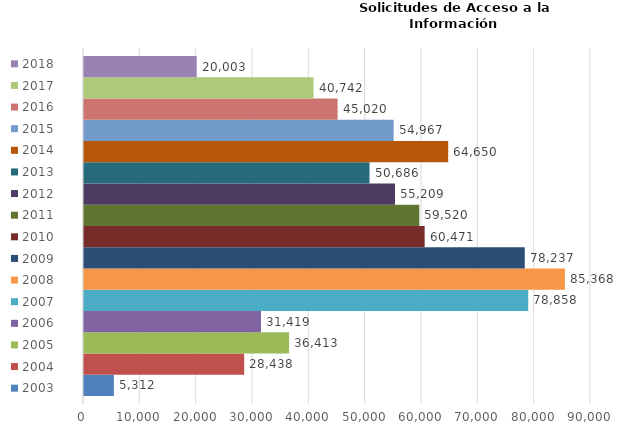
| Category | 2003 | 2004 | 2005 | 2006 | 2007 | 2008 | 2009 | 2010 | 2011 | 2012 | 2013 | 2014 | 2015 | 2016 | 2017 | 2018 |
|---|---|---|---|---|---|---|---|---|---|---|---|---|---|---|---|---|
| 0 | 5312 | 28438 | 36413 | 31419 | 78858 | 85368 | 78237 | 60471 | 59520 | 55209 | 50686 | 64650 | 54967 | 45020 | 40742 | 20003 |